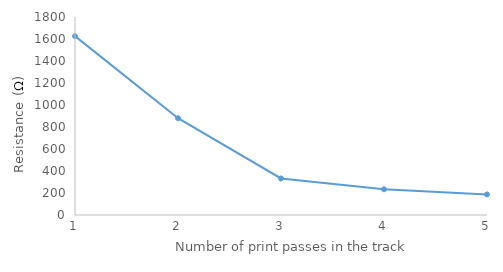
| Category | Series 0 |
|---|---|
| 1.0 | 1626 |
| 2.0 | 880 |
| 3.0 | 332 |
| 4.0 | 234 |
| 5.0 | 187 |